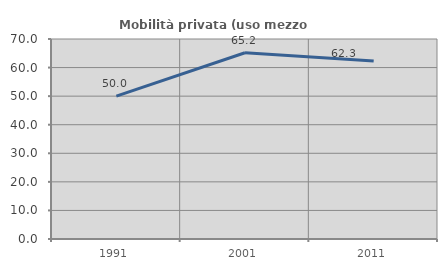
| Category | Mobilità privata (uso mezzo privato) |
|---|---|
| 1991.0 | 50 |
| 2001.0 | 65.195 |
| 2011.0 | 62.329 |